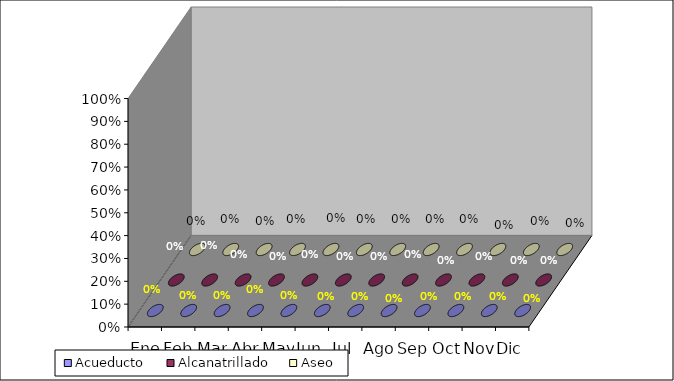
| Category | Acueducto | Alcanatrillado | Aseo |
|---|---|---|---|
| Ene | 0 | 0 | 0 |
| Feb | 0 | 0 | 0 |
| Mar | 0 | 0 | 0 |
| Abr | 0 | 0 | 0 |
| May | 0 | 0 | 0 |
| Jun | 0 | 0 | 0 |
| Jul | 0 | 0 | 0 |
| Ago | 0 | 0 | 0 |
| Sep | 0 | 0 | 0 |
| Oct | 0 | 0 | 0 |
| Nov | 0 | 0 | 0 |
| Dic | 0 | 0 | 0 |